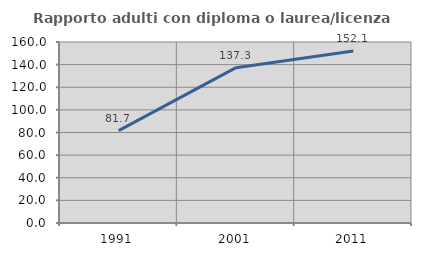
| Category | Rapporto adulti con diploma o laurea/licenza media  |
|---|---|
| 1991.0 | 81.699 |
| 2001.0 | 137.324 |
| 2011.0 | 152.113 |